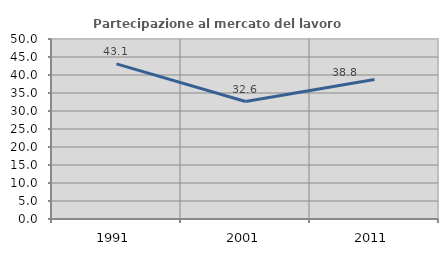
| Category | Partecipazione al mercato del lavoro  femminile |
|---|---|
| 1991.0 | 43.085 |
| 2001.0 | 32.637 |
| 2011.0 | 38.763 |